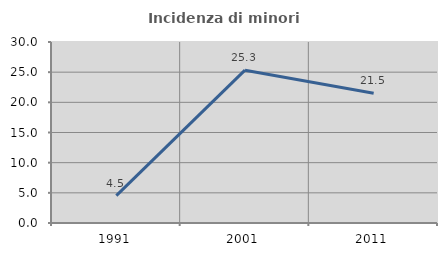
| Category | Incidenza di minori stranieri |
|---|---|
| 1991.0 | 4.545 |
| 2001.0 | 25.333 |
| 2011.0 | 21.502 |